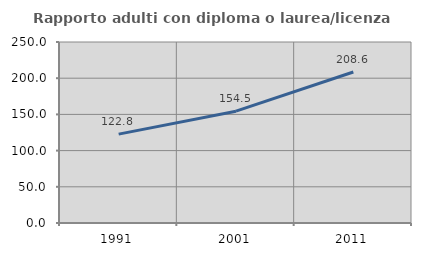
| Category | Rapporto adulti con diploma o laurea/licenza media  |
|---|---|
| 1991.0 | 122.767 |
| 2001.0 | 154.469 |
| 2011.0 | 208.587 |